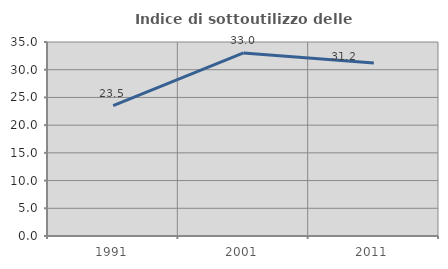
| Category | Indice di sottoutilizzo delle abitazioni  |
|---|---|
| 1991.0 | 23.529 |
| 2001.0 | 33.023 |
| 2011.0 | 31.197 |